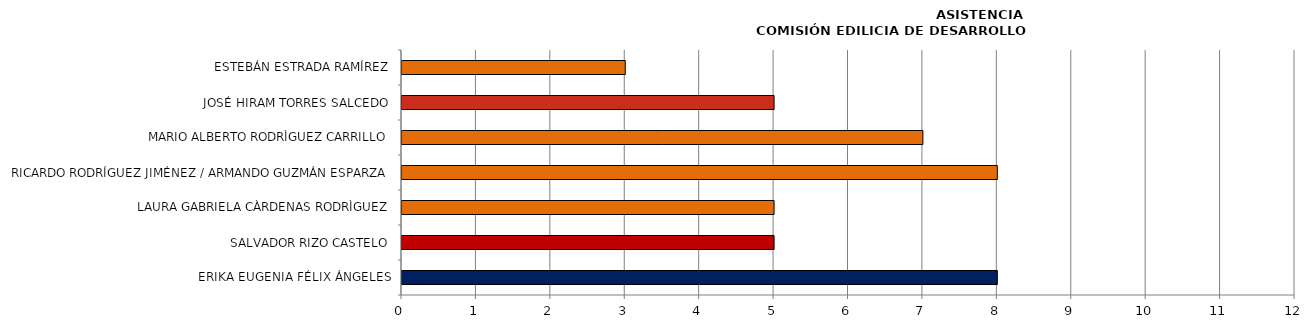
| Category | Series 0 |
|---|---|
| ERIKA EUGENIA FÉLIX ÁNGELES | 8 |
| SALVADOR RIZO CASTELO | 5 |
| LAURA GABRIELA CÀRDENAS RODRÌGUEZ | 5 |
| RICARDO RODRÍGUEZ JIMÉNEZ / ARMANDO GUZMÁN ESPARZA | 8 |
| MARIO ALBERTO RODRÌGUEZ CARRILLO | 7 |
| JOSÉ HIRAM TORRES SALCEDO | 5 |
| ESTEBÁN ESTRADA RAMÍREZ | 3 |